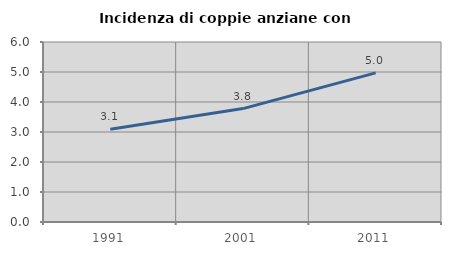
| Category | Incidenza di coppie anziane con figli |
|---|---|
| 1991.0 | 3.092 |
| 2001.0 | 3.78 |
| 2011.0 | 4.971 |